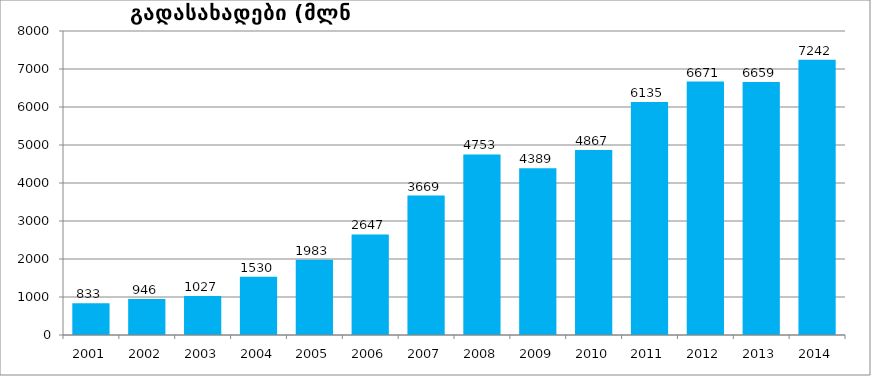
| Category | გადასახადები (მლნ ლარებში) |
|---|---|
| 2001.0 | 833.166 |
| 2002.0 | 946.194 |
| 2003.0 | 1027.441 |
| 2004.0 | 1530.251 |
| 2005.0 | 1982.665 |
| 2006.0 | 2646.541 |
| 2007.0 | 3669.089 |
| 2008.0 | 4752.657 |
| 2009.0 | 4388.874 |
| 2010.0 | 4867.441 |
| 2011.0 | 6134.752 |
| 2012.0 | 6670.969 |
| 2013.0 | 6659.296 |
| 2014.0 | 7242 |